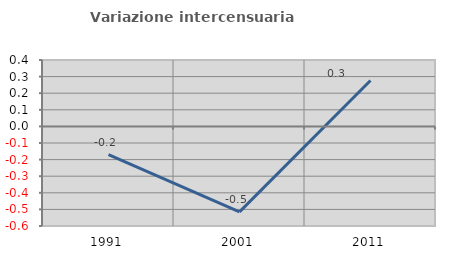
| Category | Variazione intercensuaria annua |
|---|---|
| 1991.0 | -0.171 |
| 2001.0 | -0.515 |
| 2011.0 | 0.276 |